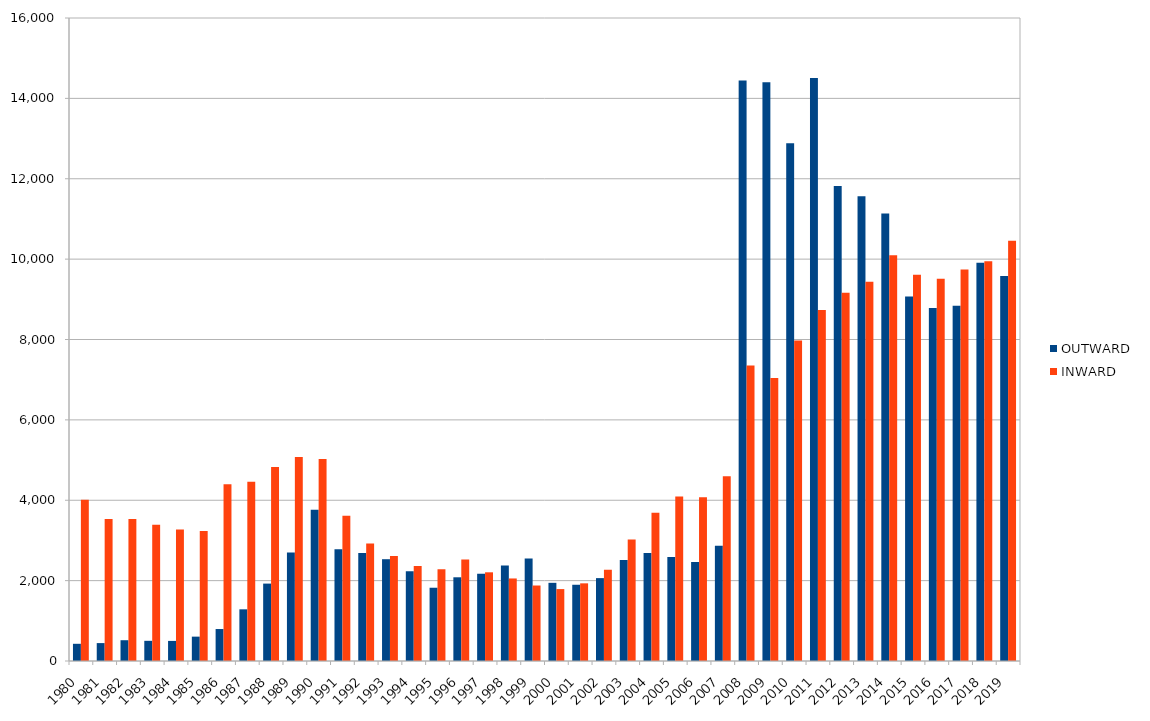
| Category | OUTWARD | INWARD |
|---|---|---|
| 1980 | 428.036 | 4013.29 |
| 1981 | 445.646 | 3532.879 |
| 1982 | 517.182 | 3532.852 |
| 1983 | 502.211 | 3388.876 |
| 1984 | 499.843 | 3273.738 |
| 1985 | 606.276 | 3237.461 |
| 1986 | 795.434 | 4397.047 |
| 1987 | 1286 | 4462 |
| 1988 | 1926 | 4826 |
| 1989 | 2700.368 | 5076.383 |
| 1990 | 3764.414 | 5025.495 |
| 1991 | 2781.018 | 3615.398 |
| 1992 | 2686 | 2923.262 |
| 1993 | 2533 | 2611.34 |
| 1994 | 2234 | 2361.9 |
| 1995 | 1823 | 2280.957 |
| 1996 | 2083 | 2526.493 |
| 1997 | 2168 | 2207.094 |
| 1998 | 2375 | 2053.807 |
| 1999 | 2552.773 | 1878.5 |
| 2000 | 1945.138 | 1789.502 |
| 2001 | 1897.127 | 1932.443 |
| 2002 | 2062.458 | 2272.672 |
| 2003 | 2513.532 | 3023.193 |
| 2004 | 2688.636 | 3688.753 |
| 2005 | 2587.679 | 4091.532 |
| 2006 | 2463.936 | 4075.828 |
| 2007 | 2870.257 | 4595.241 |
| 2008 | 14445.4 | 7354.813 |
| 2009 | 14402.099 | 7041.291 |
| 2010 | 12882.879 | 7975.133 |
| 2011 | 14509.943 | 8731.247 |
| 2012 | 11821.288 | 9166.139 |
| 2013 | 11565.683 | 9436.137 |
| 2014 | 11135.812 | 10099.257 |
| 2015 | 9067.701 | 9608.856 |
| 2016 | 8781.477 | 9513.963 |
| 2017 | 8841.573 | 9742.186 |
| 2018 | 9906.852 | 9949.657 |
| 2019 | 9577.333 | 10458.516 |